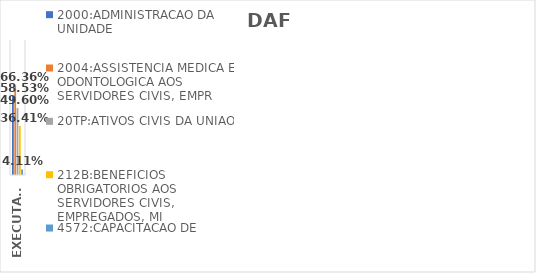
| Category | 2000:ADMINISTRACAO DA UNIDADE | 2004:ASSISTENCIA MEDICA E ODONTOLOGICA AOS SERVIDORES CIVIS, EMPR | 20TP:ATIVOS CIVIS DA UNIAO | 212B:BENEFICIOS OBRIGATORIOS AOS SERVIDORES CIVIS, EMPREGADOS, MI | 4572:CAPACITACAO DE SERVIDORES PUBLICOS FEDERAIS EM PROCESSO DE Q |
|---|---|---|---|---|---|
| EXECUTADO | 0.585 | 0.664 | 0.496 | 0.364 | 0.041 |